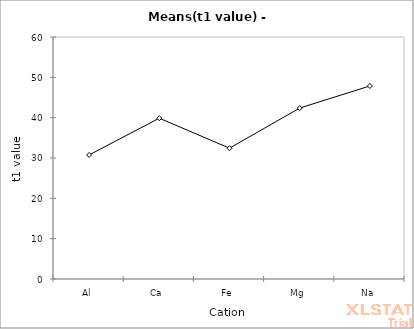
| Category | Series 0 |
|---|---|
| Al | 30.751 |
| Ca | 39.872 |
| Fe | 32.435 |
| Mg | 42.383 |
| Na | 47.858 |